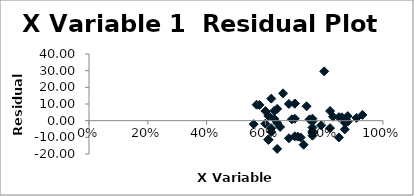
| Category | Series 0 |
|---|---|
| 0.57 | 9.57 |
| 0.76 | 1.196 |
| 0.68 | 10.038 |
| 0.61 | 2.849 |
| 0.82 | 5.815 |
| 0.79 | -2.795 |
| 0.87 | -1.136 |
| 0.76 | -0.504 |
| 0.88 | -0.566 |
| 0.74 | 8.656 |
| 0.63 | 1.189 |
| 0.93 | 3.483 |
| 0.61 | -11.251 |
| 0.76 | -4.104 |
| 0.62 | -6.781 |
| 0.68 | -10.562 |
| 0.7 | 1.177 |
| 0.64 | 7.058 |
| 0.6 | -1.821 |
| 0.86 | 1.994 |
| 0.85 | 2.124 |
| 0.87 | -5.236 |
| 0.65 | -3.772 |
| 0.76 | -9.004 |
| 0.58 | 9.44 |
| 0.62 | -4.581 |
| 0.61 | -11.551 |
| 0.72 | -10.083 |
| 0.7 | 10.277 |
| 0.73 | -14.413 |
| 0.86 | 1.694 |
| 0.8 | 29.575 |
| 0.88 | 2.734 |
| 0.69 | 0.807 |
| 0.64 | -16.942 |
| 0.64 | -1.342 |
| 0.66 | 16.398 |
| 0.76 | -6.404 |
| 0.75 | 0.726 |
| 0.91 | 1.643 |
| 0.63 | 5.789 |
| 0.7 | -9.423 |
| 0.6 | 5.779 |
| 0.7 | 10.177 |
| 0.76 | -7.304 |
| 0.85 | -10.076 |
| 0.83 | 2.385 |
| 0.82 | -4.485 |
| 0.62 | 13.219 |
| 0.71 | -9.553 |
| 0.56 | -2.1 |